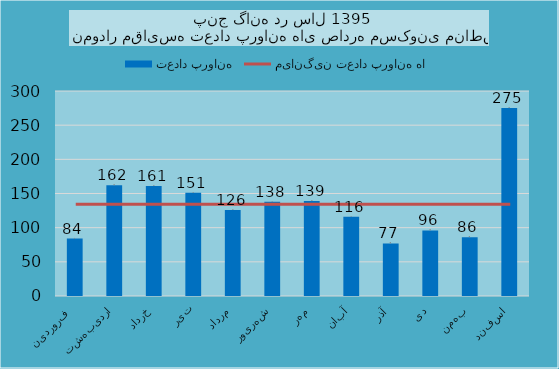
| Category | تعداد پروانه |
|---|---|
| فروردین  | 84 |
| اردیبهشت | 162 |
| خرداد | 161 |
| تیر | 151 |
| مرداد | 126 |
| شهریور | 138 |
| مهر | 139 |
| آبان | 116 |
| آذر | 77 |
| دی | 96 |
| بهمن | 86 |
| اسفند | 275 |